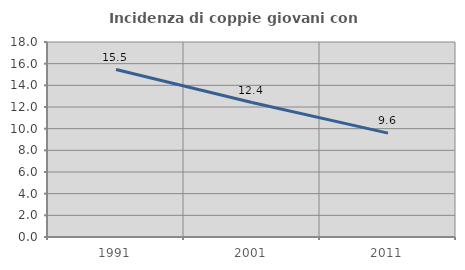
| Category | Incidenza di coppie giovani con figli |
|---|---|
| 1991.0 | 15.461 |
| 2001.0 | 12.41 |
| 2011.0 | 9.59 |